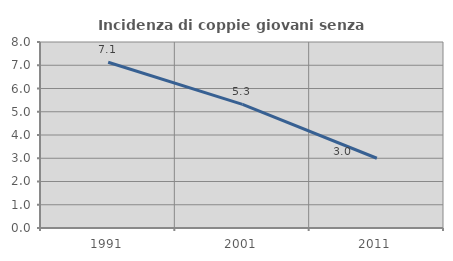
| Category | Incidenza di coppie giovani senza figli |
|---|---|
| 1991.0 | 7.129 |
| 2001.0 | 5.316 |
| 2011.0 | 3 |